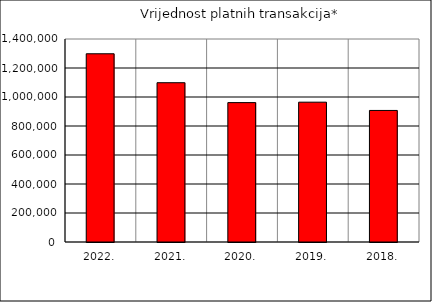
| Category | Vrijednost platnih transakcija* |
|---|---|
| 2022. | 1298099.939 |
| 2021. | 1098511.155 |
| 2020. | 961218.782 |
| 2019. | 964271.9 |
| 2018. | 907229.269 |